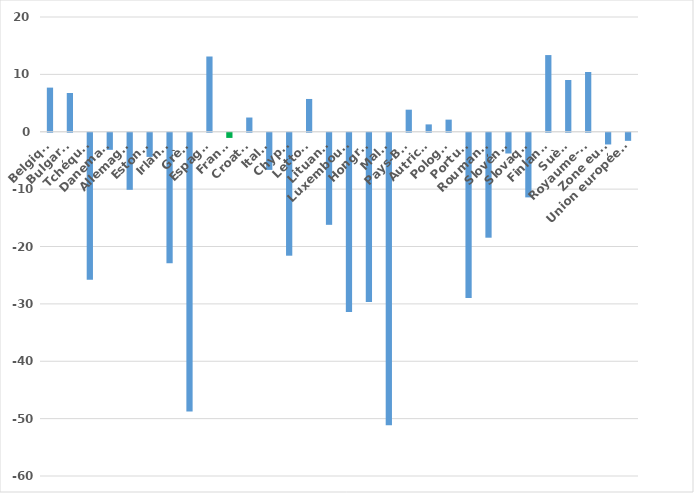
| Category | Series 0 |
|---|---|
| Belgique | 7.692 |
| Bulgarie | 6.757 |
| Tchéquie | -25.641 |
| Danemark | -2.976 |
| Allemagne | -9.945 |
| Estonie | -4.211 |
| Irlande | -22.727 |
| Grèce | -48.571 |
| Espagne | 13.115 |
| France | -0.901 |
| Croatie | 2.479 |
| Italie | -6.475 |
| Chypre | -21.429 |
| Lettonie | 5.714 |
| Lituanie | -16.049 |
| Luxembourg | -31.25 |
| Hongrie | -29.508 |
| Malte | -51 |
| Pays-Bas | 3.846 |
| Autriche | 1.282 |
| Pologne | 2.113 |
| Portugal | -28.814 |
| Roumanie | -18.293 |
| Slovénie | -3.614 |
| Slovaquie | -11.268 |
| Finlande | 13.364 |
| Suède | 9.02 |
| Royaume-Uni | 10.417 |
| Zone euro | -2.041 |
| Union européenne | -1.408 |